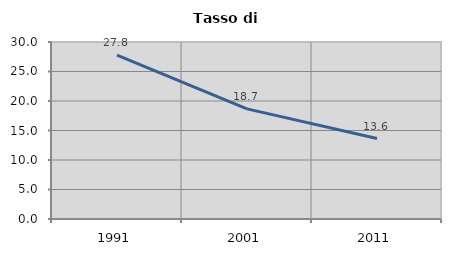
| Category | Tasso di disoccupazione   |
|---|---|
| 1991.0 | 27.782 |
| 2001.0 | 18.659 |
| 2011.0 | 13.64 |